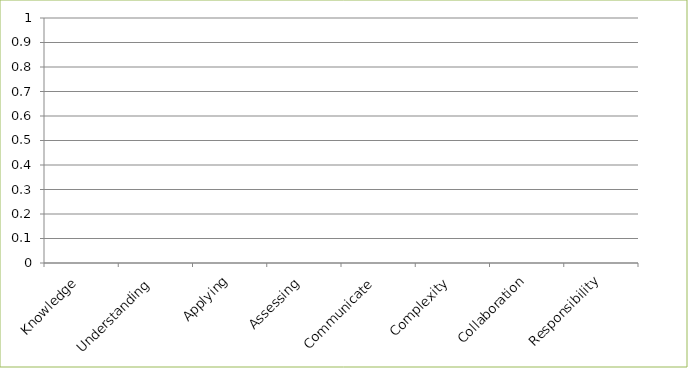
| Category | Series 0 |
|---|---|
| Knowledge | 0 |
| Understanding | 0 |
| Applying | 0 |
| Assessing | 0 |
| Communicate | 0 |
| Complexity | 0 |
| Collaboration | 0 |
| Responsibility | 0 |